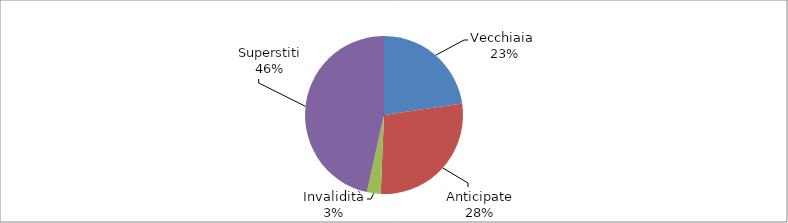
| Category | Series 0 |
|---|---|
| Vecchiaia  | 9459 |
| Anticipate | 11679 |
| Invalidità | 1175 |
| Superstiti | 19404 |